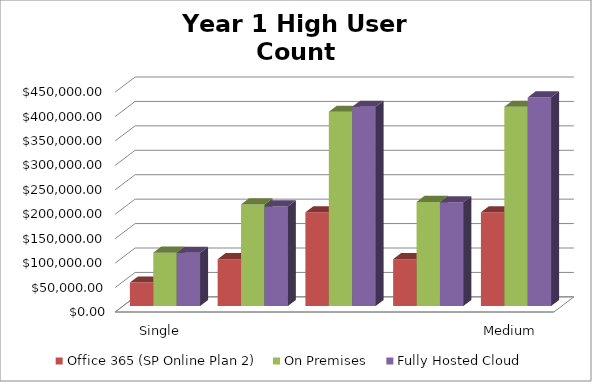
| Category | Office 365 (SP Online Plan 2)  | On Premises   | Fully Hosted Cloud   |
|---|---|---|---|
| Single Server Install (WFE and SQL on 1 VM) | 48000 | 109260.412 | 109040 |
| Small Farm - Two Server Install (WFE and SQL) | 96000 | 207982.444 | 203920 |
| Small Farm w/ High Availability (2 WFE - 2 SQL) | 192000 | 397594.125 | 407900 |
| Medium Farm (1 WFE, 1 App/Index, 1 SQL) | 96000 | 213112.403 | 212320 |
| Medium Farm w/ High Availability (2 WFE, 2 A/I, 2 SQL) | 192000 | 407943.177 | 426980 |